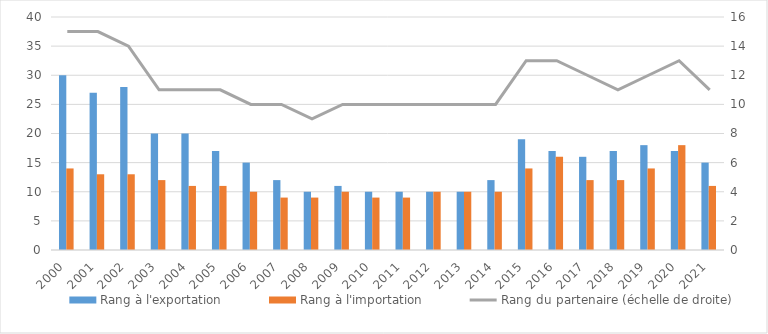
| Category | Rang à l'exportation | Rang à l'importation |
|---|---|---|
| 2000.0 | 30 | 14 |
| 2001.0 | 27 | 13 |
| 2002.0 | 28 | 13 |
| 2003.0 | 20 | 12 |
| 2004.0 | 20 | 11 |
| 2005.0 | 17 | 11 |
| 2006.0 | 15 | 10 |
| 2007.0 | 12 | 9 |
| 2008.0 | 10 | 9 |
| 2009.0 | 11 | 10 |
| 2010.0 | 10 | 9 |
| 2011.0 | 10 | 9 |
| 2012.0 | 10 | 10 |
| 2013.0 | 10 | 10 |
| 2014.0 | 12 | 10 |
| 2015.0 | 19 | 14 |
| 2016.0 | 17 | 16 |
| 2017.0 | 16 | 12 |
| 2018.0 | 17 | 12 |
| 2019.0 | 18 | 14 |
| 2020.0 | 17 | 18 |
| 2021.0 | 15 | 11 |